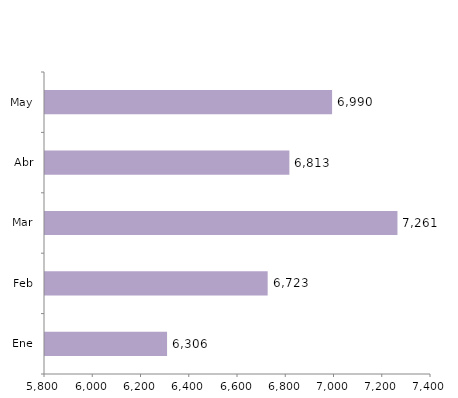
| Category | Series 0 |
|---|---|
| Ene | 6306 |
| Feb | 6723 |
| Mar | 7261 |
| Abr | 6813 |
| May | 6990 |